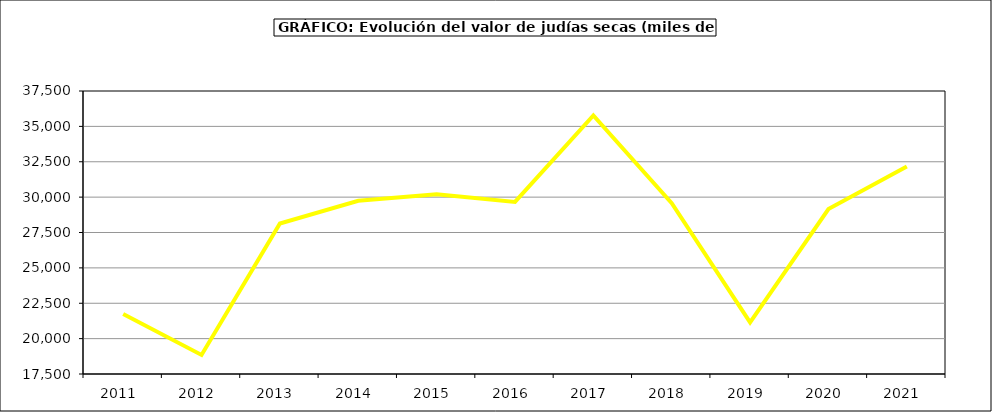
| Category | Valor |
|---|---|
| 2011.0 | 21735.778 |
| 2012.0 | 18845.19 |
| 2013.0 | 28136.167 |
| 2014.0 | 29742.558 |
| 2015.0 | 30200 |
| 2016.0 | 29661 |
| 2017.0 | 35775.053 |
| 2018.0 | 29574.266 |
| 2019.0 | 21144.982 |
| 2020.0 | 29157.15 |
| 2021.0 | 32159.864 |